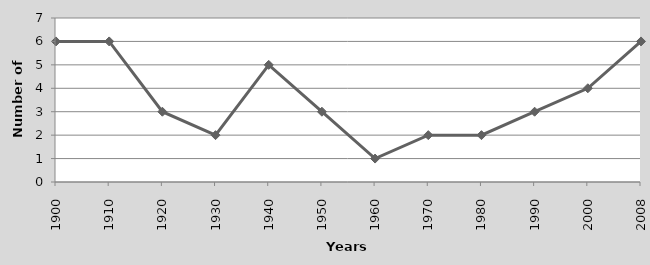
| Category | Countries with one consecutive or unlimited presidential reelection |
|---|---|
| 1900.0 | 6 |
| 1910.0 | 6 |
| 1920.0 | 3 |
| 1930.0 | 2 |
| 1940.0 | 5 |
| 1950.0 | 3 |
| 1960.0 | 1 |
| 1970.0 | 2 |
| 1980.0 | 2 |
| 1990.0 | 3 |
| 2000.0 | 4 |
| 2008.0 | 6 |